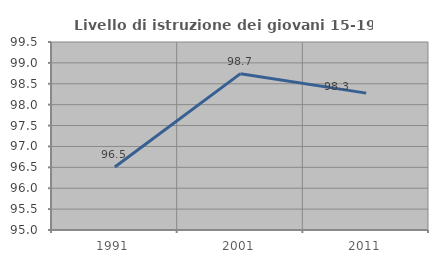
| Category | Livello di istruzione dei giovani 15-19 anni |
|---|---|
| 1991.0 | 96.508 |
| 2001.0 | 98.742 |
| 2011.0 | 98.276 |